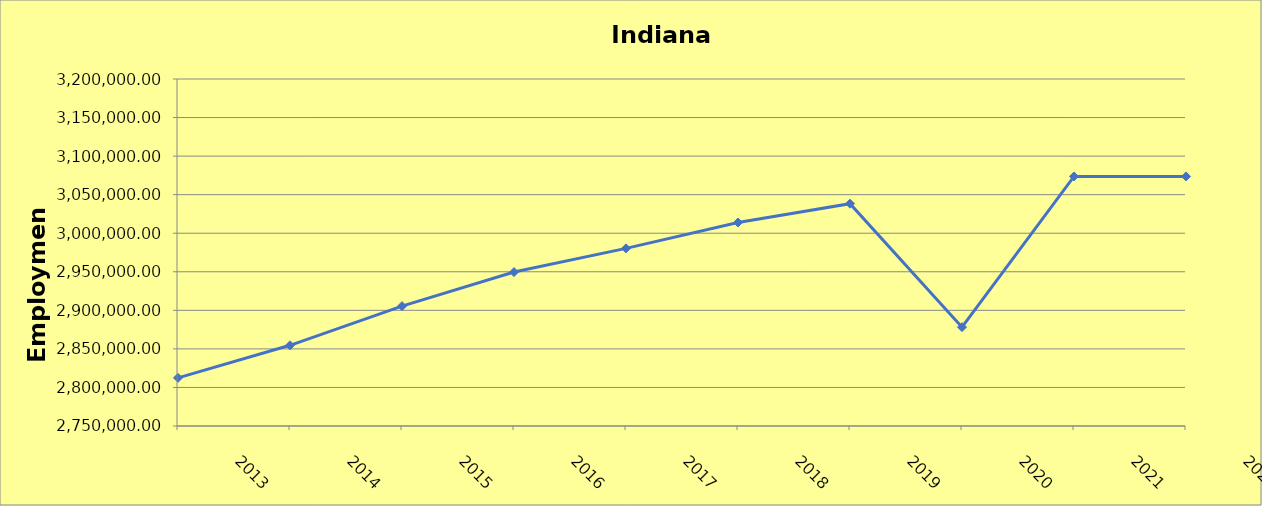
| Category | Indiana Totals |
|---|---|
| 2013.0 | 2812420 |
| 2014.0 | 2854650 |
| 2015.0 | 2905440 |
| 2016.0 | 2949630 |
| 2017.0 | 2980370 |
| 2018.0 | 3013910 |
| 2019.0 | 3038290 |
| 2020.0 | 2878170 |
| 2021.0 | 3073660 |
| 2022.0 | 3073655 |